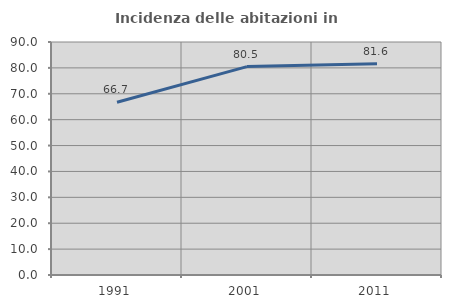
| Category | Incidenza delle abitazioni in proprietà  |
|---|---|
| 1991.0 | 66.742 |
| 2001.0 | 80.504 |
| 2011.0 | 81.63 |